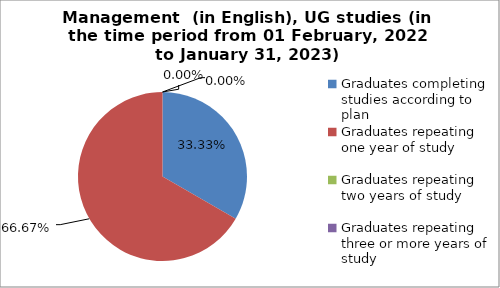
| Category | Series 0 |
|---|---|
| Graduates completing studies according to plan | 33.333 |
| Graduates repeating one year of study | 66.667 |
| Graduates repeating two years of study | 0 |
| Graduates repeating three or more years of study | 0 |